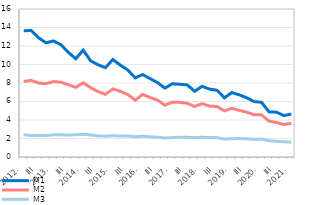
| Category | M1 | M2 | M3 |
|---|---|---|---|
| 2012. | 13.639 | 8.164 | 2.423 |
| II | 13.689 | 8.283 | 2.318 |
| III | 12.893 | 8.004 | 2.327 |
| IV | 12.342 | 7.926 | 2.321 |
| 2013. | 12.547 | 8.164 | 2.409 |
| II | 12.14 | 8.086 | 2.399 |
| III | 11.324 | 7.815 | 2.38 |
| IV | 10.614 | 7.526 | 2.4 |
| 2014. | 11.557 | 8.031 | 2.452 |
| II | 10.403 | 7.493 | 2.391 |
| III | 9.972 | 7.067 | 2.282 |
| IV | 9.656 | 6.777 | 2.251 |
| 2015. | 10.539 | 7.363 | 2.3 |
| II | 9.933 | 7.097 | 2.275 |
| III | 9.408 | 6.752 | 2.281 |
| IV | 8.554 | 6.143 | 2.191 |
| 2016. | 8.914 | 6.764 | 2.241 |
| II | 8.476 | 6.441 | 2.181 |
| III | 8.039 | 6.151 | 2.143 |
| IV | 7.449 | 5.602 | 2.061 |
| 2017. | 7.914 | 5.927 | 2.098 |
| II | 7.864 | 5.906 | 2.134 |
| III | 7.796 | 5.812 | 2.131 |
| IV | 7.109 | 5.459 | 2.092 |
| 2018. | 7.639 | 5.765 | 2.144 |
| II | 7.345 | 5.506 | 2.096 |
| III | 7.214 | 5.455 | 2.097 |
| IV | 6.403 | 4.984 | 1.947 |
| 2019. | 6.962 | 5.26 | 1.981 |
| II | 6.724 | 5.045 | 1.993 |
| III | 6.399 | 4.846 | 1.962 |
| IV | 5.996 | 4.566 | 1.919 |
| 2020. | 5.913 | 4.555 | 1.934 |
| II | 4.881 | 3.881 | 1.754 |
| III | 4.844 | 3.723 | 1.699 |
| IV | 4.478 | 3.516 | 1.638 |
| 2021. | 4.641 | 3.635 | 1.627 |